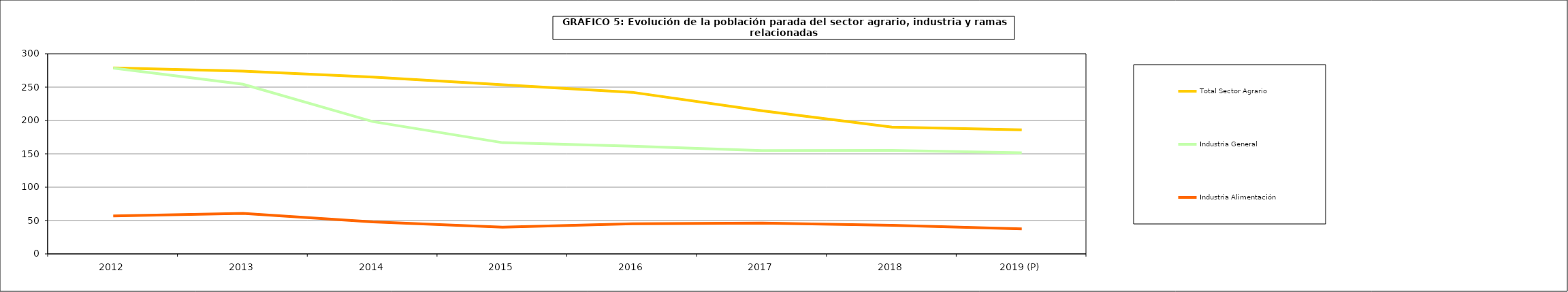
| Category | Total Sector Agrario | Industria General | Industria Alimentación |
|---|---|---|---|
| 2012 | 278.9 | 278.675 | 56.8 |
| 2013 | 273.925 | 254.3 | 60.8 |
| 2014 | 265.1 | 198.3 | 47.85 |
| 2015 | 253.575 | 166.725 | 40.1 |
| 2016 | 242.2 | 161.6 | 45.23 |
| 2017 | 214.5 | 154.8 | 46.3 |
| 2018 | 190.1 | 154.975 | 42.9 |
| 2019 (P) | 186.075 | 151.6 | 37.575 |